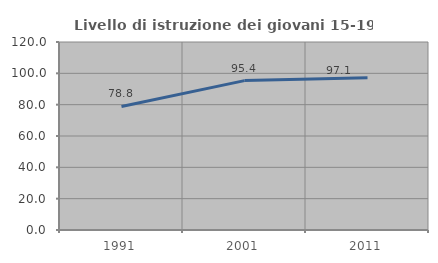
| Category | Livello di istruzione dei giovani 15-19 anni |
|---|---|
| 1991.0 | 78.842 |
| 2001.0 | 95.359 |
| 2011.0 | 97.101 |